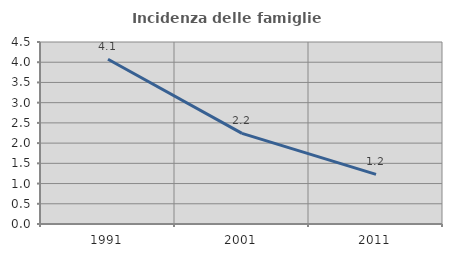
| Category | Incidenza delle famiglie numerose |
|---|---|
| 1991.0 | 4.073 |
| 2001.0 | 2.24 |
| 2011.0 | 1.225 |